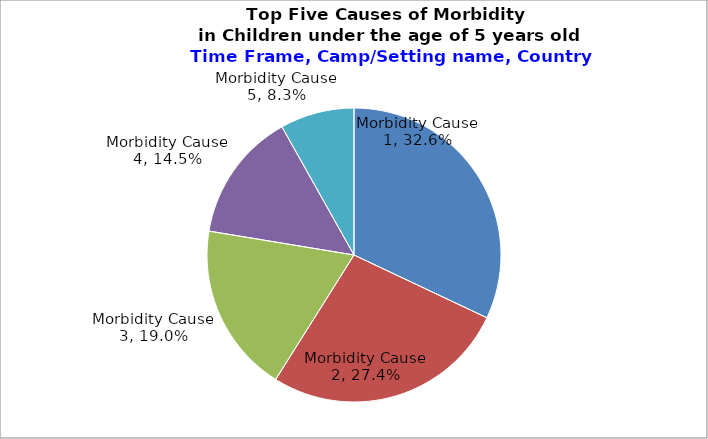
| Category | Series 1 |
|---|---|
| Morbidity Cause 1 | 0.326 |
| Morbidity Cause 2 | 0.274 |
| Morbidity Cause 3 | 0.19 |
| Morbidity Cause 4 | 0.145 |
| Morbidity Cause 5 | 0.083 |